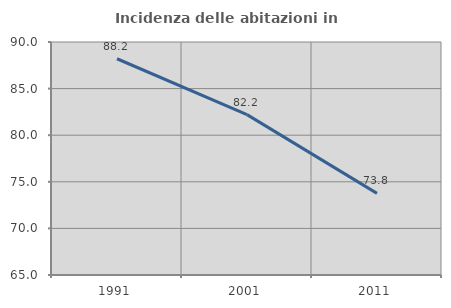
| Category | Incidenza delle abitazioni in proprietà  |
|---|---|
| 1991.0 | 88.203 |
| 2001.0 | 82.206 |
| 2011.0 | 73.756 |